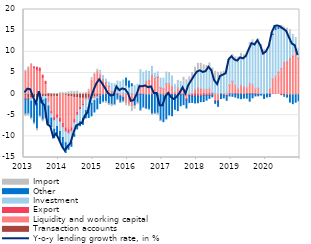
| Category | Transaction accounts | Liquidity and working capital | Export | Investment | Other | Import |
|---|---|---|---|---|---|---|
| 2013-01-01 | -0.509 | 5.466 | -0.655 | 0.157 | -3.557 | -0.62 |
| 2013-02-01 | -0.821 | 6.307 | -0.351 | 0.101 | -3.442 | -0.636 |
| 2013-03-01 | -0.908 | 7.144 | -0.174 | -0.604 | -3.955 | -0.473 |
| 2013-04-01 | -0.906 | 6.265 | 0.188 | -0.805 | -5.11 | -0.441 |
| 2013-05-01 | -1.028 | 5.791 | 0.566 | -1.205 | -5.942 | -0.539 |
| 2013-06-01 | -0.715 | 5.566 | 0.59 | -0.246 | -4.209 | -0.467 |
| 2013-07-01 | -0.656 | 3.962 | 0.527 | -0.788 | -4.619 | -0.522 |
| 2013-08-01 | -0.571 | 2.543 | 0.475 | -0.574 | -4.455 | -0.211 |
| 2013-09-01 | -0.597 | -1.463 | 0.046 | -0.788 | -4.325 | -0.17 |
| 2013-10-01 | -0.731 | -3.405 | -0.479 | -1.101 | -1.998 | -0.034 |
| 2013-11-01 | -0.534 | -5.012 | -0.697 | -2.071 | -1.999 | 0.032 |
| 2013-12-01 | -0.631 | -4.25 | -0.793 | -2 | -1.812 | 0.042 |
| 2014-01-01 | -0.248 | -5.468 | -0.921 | -2.223 | -2.314 | 0.338 |
| 2014-02-01 | -0.244 | -6.677 | -0.967 | -2.397 | -2.478 | 0.345 |
| 2014-03-01 | -0.312 | -7.664 | -0.914 | -2.634 | -2.299 | 0.368 |
| 2014-04-01 | -0.598 | -7.82 | -0.878 | -2.779 | -0.977 | 0.561 |
| 2014-05-01 | -0.678 | -7.271 | -0.835 | -2.63 | -0.953 | 0.634 |
| 2014-06-01 | -0.89 | -5.133 | -0.763 | -2.735 | -0.458 | 0.61 |
| 2014-07-01 | -0.861 | -3.427 | -0.672 | -2.518 | -0.758 | 0.681 |
| 2014-08-01 | -1.004 | -2.174 | -0.467 | -2.918 | -0.917 | 0.276 |
| 2014-09-01 | -1.021 | -1.308 | -0.375 | -3.018 | -1.426 | 0.243 |
| 2014-10-01 | -0.819 | 0.161 | -0.34 | -2.752 | -1.718 | 0.247 |
| 2014-11-01 | -0.858 | 0.695 | -0.279 | -2.093 | -2.317 | 0.459 |
| 2014-12-01 | -0.577 | 3.263 | -0.264 | -1.35 | -2.967 | 0.625 |
| 2015-01-01 | -0.712 | 4.673 | -0.142 | -0.704 | -2.68 | 0.34 |
| 2015-02-01 | -0.565 | 5.321 | -0.111 | -0.407 | -2.409 | 0.553 |
| 2015-03-01 | -0.434 | 4.59 | 0.008 | 0.669 | -1.773 | 0.324 |
| 2015-04-01 | -0.175 | 3.498 | 0.044 | 0.845 | -1.638 | -0.132 |
| 2015-05-01 | -0.054 | 2.82 | 0.068 | 0.654 | -1.651 | -0.488 |
| 2015-06-01 | 0.05 | 1.84 | 0.063 | 0.904 | -2.258 | -0.459 |
| 2015-07-01 | 0.129 | 0.502 | 0.07 | 1.849 | -2.403 | -0.592 |
| 2015-08-01 | 0.104 | 0.009 | -0.067 | 2.291 | -2.376 | -0.307 |
| 2015-09-01 | 0.112 | 0.208 | -0.055 | 2.751 | -1.148 | -0.214 |
| 2015-10-01 | 0.038 | -0.411 | -0.06 | 2.883 | -1.421 | -0.215 |
| 2015-11-01 | 0.131 | -0.703 | -0.076 | 3.2 | -0.895 | -0.44 |
| 2015-12-01 | 0.06 | -2.198 | 0.008 | 2.045 | 1.664 | -0.542 |
| 2016-01-01 | 0.112 | -2.269 | -0.03 | 1.566 | 1.404 | -0.65 |
| 2016-02-01 | 0.086 | -3.097 | 0.005 | 1.894 | 0.462 | -1.069 |
| 2016-03-01 | 0.054 | -1.187 | -0.022 | 1.97 | -1.494 | -0.878 |
| 2016-04-01 | 0.002 | 0.259 | -0.024 | 2.055 | -1.952 | -0.542 |
| 2016-05-01 | -0.049 | 2.232 | -0.014 | 3.525 | -3.719 | -0.201 |
| 2016-06-01 | -0.049 | 2.038 | 0.004 | 3.11 | -3.101 | -0.262 |
| 2016-07-01 | -0.188 | 3.046 | 0.004 | 2.456 | -3.237 | -0.159 |
| 2016-08-01 | -0.222 | 3.353 | 0.003 | 1.994 | -3.361 | -0.259 |
| 2016-09-01 | -0.107 | 4.637 | 0.003 | 1.923 | -4.549 | -0.209 |
| 2016-10-01 | -0.069 | 3.752 | 0.02 | 1.099 | -4.471 | -0.197 |
| 2016-11-01 | 0.003 | 4.032 | 0.118 | 1.076 | -4.499 | -0.6 |
| 2016-12-01 | -0.126 | 1.493 | 0.07 | 2.199 | -6.059 | -0.332 |
| 2017-01-01 | -0.287 | 1.255 | 0.034 | 2.468 | -6.239 | 0.016 |
| 2017-02-01 | -0.028 | 2.502 | 0.033 | 2.337 | -5.845 | 0.328 |
| 2017-03-01 | -0.212 | 2.639 | -0.061 | 2.218 | -4.66 | 0.242 |
| 2017-04-01 | 0.006 | 1.986 | -0.118 | 2.178 | -5.005 | 0.123 |
| 2017-05-01 | -0.021 | 0.622 | -0.131 | 1.488 | -3.457 | 0.202 |
| 2017-06-01 | -0.058 | 1.637 | -0.146 | 1.1 | -3.715 | 0.504 |
| 2017-07-01 | 0.066 | 0.742 | -0.146 | 1.936 | -2.615 | 0.257 |
| 2017-08-01 | 0.095 | 1.091 | -0.147 | 1.891 | -2.348 | 0.891 |
| 2017-09-01 | -0.033 | -1.003 | -0.338 | 2.229 | -1.931 | 1.128 |
| 2017-10-01 | 0.035 | -0.002 | -0.349 | 2.95 | -1.675 | 1.076 |
| 2017-11-01 | -0.038 | 0.191 | -0.423 | 3.298 | -1.519 | 1.614 |
| 2017-12-01 | 0.111 | 1.115 | -0.472 | 3.68 | -1.636 | 1.452 |
| 2018-01-01 | -0.017 | 1.678 | -0.449 | 4.093 | -1.582 | 1.485 |
| 2018-02-01 | -0.076 | 1.395 | -0.446 | 4.432 | -1.275 | 1.464 |
| 2018-03-01 | 0.181 | 0.968 | -0.353 | 4.465 | -1.426 | 1.286 |
| 2018-04-01 | 0.071 | 1.103 | -0.297 | 4.181 | -1.141 | 1.381 |
| 2018-05-01 | 0.137 | 1.251 | -0.296 | 4.4 | -0.726 | 1.574 |
| 2018-06-01 | 0.284 | 0.134 | -0.277 | 4.559 | -0.377 | 1.191 |
| 2018-07-01 | 0.145 | -1.444 | -0.282 | 3.523 | -0.476 | 1.691 |
| 2018-08-01 | 0.047 | -1.482 | -0.277 | 3.826 | -1.138 | 1.281 |
| 2018-09-01 | 0.187 | 0.07 | -0.088 | 3.999 | -0.981 | 0.962 |
| 2018-10-01 | 0.165 | -0.154 | -0.086 | 4.312 | -0.67 | 0.902 |
| 2018-11-01 | 0.151 | -0.294 | -0.083 | 5.778 | -1.1 | 0.383 |
| 2018-12-01 | 0.121 | 2.002 | 0.005 | 5.72 | -0.449 | 0.69 |
| 2019-01-01 | 0.084 | 2.964 | 0.003 | 5.799 | -0.532 | 0.511 |
| 2019-02-01 | 0.122 | 2.071 | -0.001 | 6.112 | -0.71 | 0.483 |
| 2019-03-01 | -0.043 | 1.384 | -0.007 | 6.432 | -0.89 | 0.926 |
| 2019-04-01 | -0.017 | 2.209 | -0.007 | 6.458 | -1.061 | 0.975 |
| 2019-05-01 | -0.065 | 1.864 | -0.007 | 6.82 | -0.881 | 0.597 |
| 2019-06-01 | 0.071 | 1.52 | -0.011 | 7.649 | -0.954 | 0.599 |
| 2019-07-01 | 0.174 | 2.439 | -0.011 | 8.965 | -1.672 | 0.577 |
| 2019-08-01 | 0.114 | 2.222 | -0.011 | 10.233 | -0.877 | 0.238 |
| 2019-09-01 | 0.013 | 1.329 | -0.011 | 10.479 | -0.423 | 0.206 |
| 2019-10-31 | -0.066 | 1.541 | -0.01 | 11.047 | -0.342 | 0.436 |
| 2019-11-30 | -0.091 | 0.084 | -0.01 | 10.759 | -0.137 | 0.843 |
| 2019-12-31 | -0.112 | -0.022 | -0.01 | 10.098 | -0.896 | 0.408 |
| 2020-01-31 | 0.054 | 0.141 | -0.01 | 9.923 | -0.677 | 0.532 |
| 2020-02-29 | -0.038 | 1.384 | -0.005 | 9.987 | -0.557 | 0.483 |
| 2020-03-31 | 0.142 | 3.609 | 0 | 10.341 | 0.142 | 0.224 |
| 2020-04-30 | 0.16 | 4.087 | 0 | 11.041 | 0.559 | 0.149 |
| 2020-05-31 | -0.034 | 5.187 | 0.005 | 10.338 | 0.308 | 0.306 |
| 2020-06-30 | -0.38 | 6.042 | 0.022 | 9.534 | 0.223 | 0.414 |
| 2020-07-31 | -0.388 | 7.439 | 0.076 | 8.138 | -0.127 | 0.2 |
| 2020-08-31 | -0.211 | 7.694 | 0.075 | 7.348 | -0.512 | 0.459 |
| 2020-09-30 | -0.276 | 8.456 | 0.072 | 6.174 | -1.624 | 0.508 |
| 2020-10-31 | -0.209 | 9.015 | 0.061 | 4.618 | -2.062 | 0.415 |
| 2020-11-30 | -0.198 | 10.255 | 0.062 | 2.65 | -1.729 | 0.415 |
| 2020-12-31 | -0.289 | 8.535 | 0.053 | 1.681 | -1.31 | 0.431 |